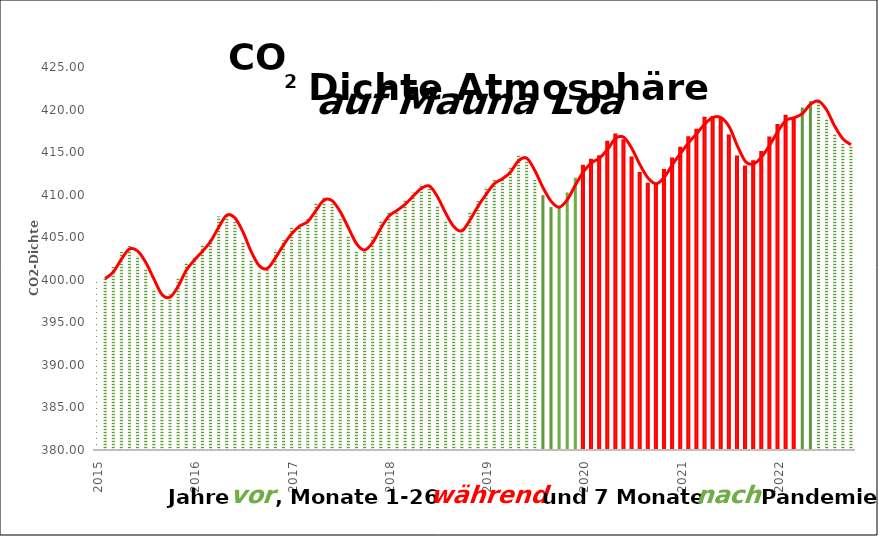
| Category | Series 0 | Series 1 |
|---|---|---|
| 2015 |  | 399.98 |
|   |  | 400.28 |
|   |  | 401.54 |
|  |  | 403.28 |
|  |  | 403.96 |
|  |  | 402.8 |
|  |  | 401.31 |
|  |  | 398.93 |
|  |  | 397.63 |
|  |  | 398.29 |
|  |  | 400.16 |
|  |  | 402.06 |
| 2016 |  | 402.56 |
|  |  | 404.12 |
|  |  | 404.87 |
|  |  | 407.45 |
|  |  | 407.72 |
|  |  | 406.83 |
|  |  | 404.41 |
|  |  | 402.27 |
|  |  | 401.05 |
|  |  | 401.6 |
|  |  | 403.53 |
|  |  | 404.64 |
| 2017 |  | 406.17 |
|  |  | 406.46 |
|  |  | 407.22 |
|  |  | 409.04 |
|  |  | 409.69 |
|  |  | 408.88 |
|  |  | 407.12 |
|  |  | 405.13 |
|  |  | 403.37 |
|  |  | 403.63 |
|  |  | 405.12 |
|  |  | 407 |
| 2018 |  | 407.96 |
|  |  | 408.32 |
|  |  | 409.41 |
|  |  | 410.24 |
|  |  | 411.24 |
|  |  | 410.79 |
|  |  | 408.71 |
|  |  | 406.99 |
|  |  | 405.51 |
|  |  | 406 |
|  |  | 408.02 |
|  |  | 409.27 |
| 2019 |  | 410.83 |
|  |  | 411.75 |
|  |  | 411.97 |
|  |  | 413.32 |
|  |  | 414.66 |
|  |  | 413.92 |
|  |  | 411.77 |
|  |  | 409.94 |
|  |  | 408.54 |
|  |  | 408.52 |
|  |  | 410.25 |
|  |  | 411.98 |
| 2020 |  | 413.4 |
|  |  | 414.11 |
|  |  | 414.5 |
|  |  | 416.21 |
|  |  | 417.07 |
|  |  | 416.38 |
|  |  | 414.38 |
|  |  | 412.55 |
|  |  | 411.29 |
|  |  | 411.28 |
|  |  | 412.89 |
|  |  | 414.25 |
| 2021 |  | 415.52 |
|  |  | 416.75 |
|  |  | 417.64 |
|  |  | 419.05 |
|  |  | 419.13 |
|  |  | 418.94 |
|  |  | 416.96 |
|  |  | 414.47 |
|  |  | 413.3 |
|  |  | 413.93 |
|  |  | 415.01 |
|  |  | 416.71 |
| 2022 |  | 418.19 |